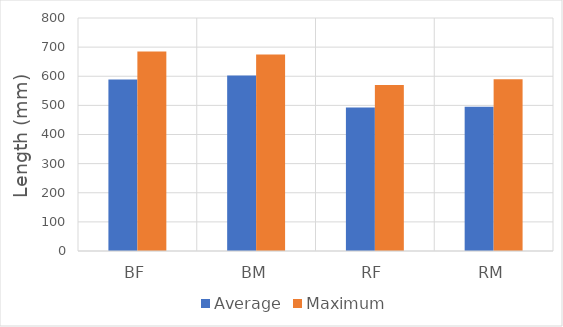
| Category | Average | Maximum |
|---|---|---|
| BF | 589 | 685 |
| BM | 603 | 675 |
| RF | 493 | 570 |
| RM | 495 | 590 |